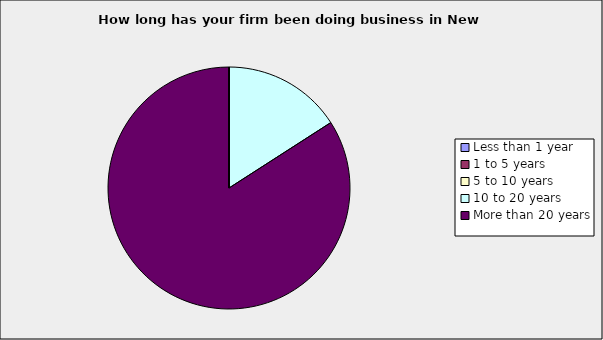
| Category | Series 0 |
|---|---|
| Less than 1 year | 0 |
| 1 to 5 years | 0 |
| 5 to 10 years | 0 |
| 10 to 20 years | 0.159 |
| More than 20 years | 0.841 |